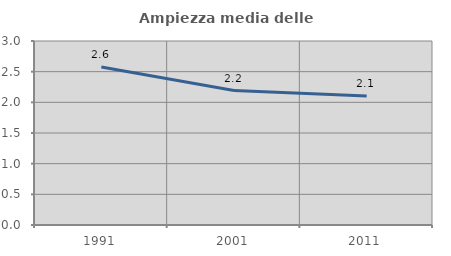
| Category | Ampiezza media delle famiglie |
|---|---|
| 1991.0 | 2.575 |
| 2001.0 | 2.191 |
| 2011.0 | 2.104 |